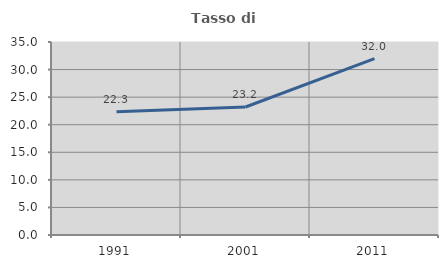
| Category | Tasso di occupazione   |
|---|---|
| 1991.0 | 22.342 |
| 2001.0 | 23.217 |
| 2011.0 | 31.984 |